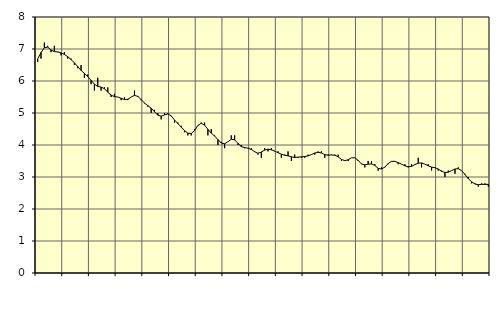
| Category | Piggar | Jordbruk, skogsbruk o fiske, SNI 01-03 |
|---|---|---|
| nan | 6.6 | 6.69 |
| 87.0 | 6.7 | 6.89 |
| 87.0 | 7.2 | 7.04 |
| 87.0 | 7.1 | 7.06 |
| nan | 6.9 | 6.97 |
| 88.0 | 7.1 | 6.92 |
| 88.0 | 6.9 | 6.91 |
| 88.0 | 6.8 | 6.88 |
| nan | 6.9 | 6.83 |
| 89.0 | 6.7 | 6.76 |
| 89.0 | 6.7 | 6.67 |
| 89.0 | 6.5 | 6.57 |
| nan | 6.4 | 6.45 |
| 90.0 | 6.5 | 6.33 |
| 90.0 | 6.1 | 6.24 |
| 90.0 | 6.2 | 6.14 |
| nan | 5.9 | 6.02 |
| 91.0 | 5.7 | 5.9 |
| 91.0 | 6.1 | 5.83 |
| 91.0 | 5.7 | 5.81 |
| nan | 5.8 | 5.76 |
| 92.0 | 5.8 | 5.65 |
| 92.0 | 5.5 | 5.56 |
| 92.0 | 5.6 | 5.51 |
| nan | 5.5 | 5.5 |
| 93.0 | 5.4 | 5.46 |
| 93.0 | 5.5 | 5.42 |
| 93.0 | 5.4 | 5.43 |
| nan | 5.5 | 5.5 |
| 94.0 | 5.7 | 5.55 |
| 94.0 | 5.5 | 5.52 |
| 94.0 | 5.4 | 5.42 |
| nan | 5.3 | 5.31 |
| 95.0 | 5.2 | 5.23 |
| 95.0 | 5 | 5.15 |
| 95.0 | 5.1 | 5.04 |
| nan | 5 | 4.93 |
| 96.0 | 4.8 | 4.9 |
| 96.0 | 5 | 4.94 |
| 96.0 | 5 | 4.97 |
| nan | 4.9 | 4.91 |
| 97.0 | 4.7 | 4.78 |
| 97.0 | 4.7 | 4.67 |
| 97.0 | 4.6 | 4.56 |
| nan | 4.4 | 4.45 |
| 98.0 | 4.3 | 4.37 |
| 98.0 | 4.3 | 4.36 |
| 98.0 | 4.5 | 4.45 |
| nan | 4.6 | 4.61 |
| 99.0 | 4.7 | 4.68 |
| 99.0 | 4.7 | 4.62 |
| 99.0 | 4.3 | 4.49 |
| nan | 4.5 | 4.37 |
| 0.0 | 4.3 | 4.28 |
| 0.0 | 4 | 4.17 |
| 0.0 | 4.1 | 4.06 |
| nan | 3.9 | 4.04 |
| 1.0 | 4.1 | 4.1 |
| 1.0 | 4.3 | 4.18 |
| 1.0 | 4.3 | 4.16 |
| nan | 4 | 4.05 |
| 2.0 | 4 | 3.95 |
| 2.0 | 3.9 | 3.92 |
| 2.0 | 3.9 | 3.9 |
| nan | 3.9 | 3.86 |
| 3.0 | 3.8 | 3.79 |
| 3.0 | 3.7 | 3.74 |
| 3.0 | 3.6 | 3.78 |
| nan | 3.9 | 3.84 |
| 4.0 | 3.8 | 3.87 |
| 4.0 | 3.9 | 3.85 |
| 4.0 | 3.8 | 3.81 |
| nan | 3.8 | 3.76 |
| 5.0 | 3.6 | 3.71 |
| 5.0 | 3.7 | 3.68 |
| 5.0 | 3.8 | 3.66 |
| nan | 3.5 | 3.63 |
| 6.0 | 3.7 | 3.61 |
| 6.0 | 3.6 | 3.62 |
| 6.0 | 3.6 | 3.63 |
| nan | 3.6 | 3.64 |
| 7.0 | 3.7 | 3.66 |
| 7.0 | 3.7 | 3.7 |
| 7.0 | 3.7 | 3.75 |
| nan | 3.8 | 3.77 |
| 8.0 | 3.8 | 3.75 |
| 8.0 | 3.6 | 3.7 |
| 8.0 | 3.7 | 3.68 |
| nan | 3.7 | 3.69 |
| 9.0 | 3.7 | 3.68 |
| 9.0 | 3.7 | 3.63 |
| 9.0 | 3.5 | 3.55 |
| nan | 3.5 | 3.51 |
| 10.0 | 3.5 | 3.54 |
| 10.0 | 3.6 | 3.6 |
| 10.0 | 3.6 | 3.6 |
| nan | 3.5 | 3.52 |
| 11.0 | 3.4 | 3.41 |
| 11.0 | 3.3 | 3.38 |
| 11.0 | 3.5 | 3.4 |
| nan | 3.5 | 3.41 |
| 12.0 | 3.4 | 3.36 |
| 12.0 | 3.2 | 3.27 |
| 12.0 | 3.3 | 3.25 |
| nan | 3.3 | 3.31 |
| 13.0 | 3.4 | 3.42 |
| 13.0 | 3.5 | 3.49 |
| 13.0 | 3.5 | 3.49 |
| nan | 3.4 | 3.45 |
| 14.0 | 3.4 | 3.4 |
| 14.0 | 3.4 | 3.35 |
| 14.0 | 3.3 | 3.32 |
| nan | 3.4 | 3.33 |
| 15.0 | 3.4 | 3.39 |
| 15.0 | 3.6 | 3.43 |
| 15.0 | 3.3 | 3.44 |
| nan | 3.4 | 3.4 |
| 16.0 | 3.4 | 3.35 |
| 16.0 | 3.2 | 3.31 |
| 16.0 | 3.3 | 3.29 |
| nan | 3.2 | 3.25 |
| 17.0 | 3.2 | 3.18 |
| 17.0 | 3 | 3.14 |
| 17.0 | 3.2 | 3.15 |
| nan | 3.2 | 3.2 |
| 18.0 | 3.1 | 3.25 |
| 18.0 | 3.3 | 3.26 |
| 18.0 | 3.2 | 3.2 |
| nan | 3.1 | 3.08 |
| 19.0 | 3 | 2.95 |
| 19.0 | 2.8 | 2.85 |
| 19.0 | 2.8 | 2.78 |
| nan | 2.7 | 2.76 |
| 20.0 | 2.8 | 2.77 |
| 20.0 | 2.8 | 2.77 |
| 20.0 | 2.7 | 2.77 |